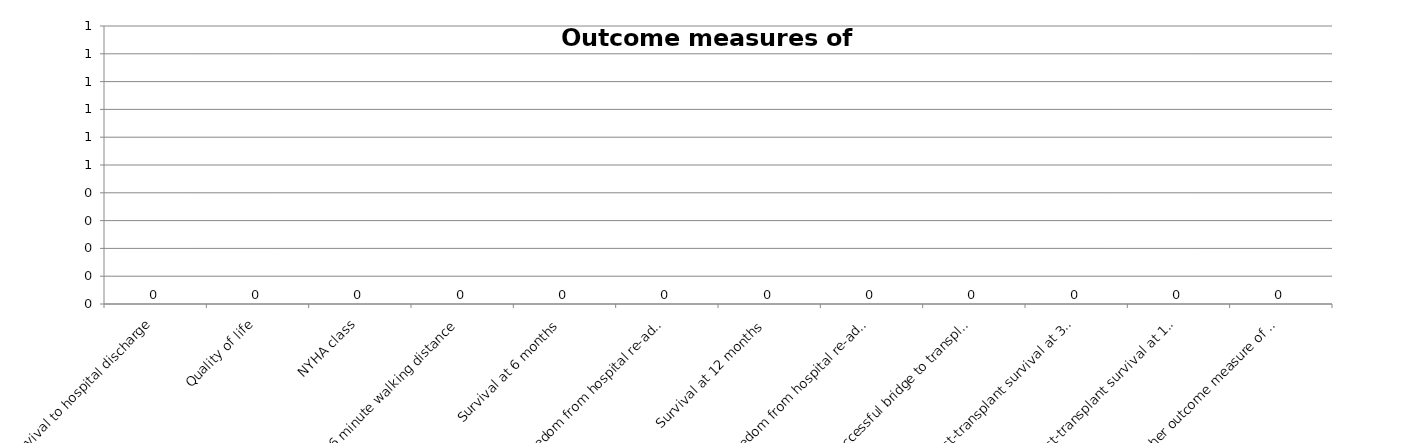
| Category | Series 0 |
|---|---|
| Survival to hospital discharge | 0 |
| Quality of life | 0 |
| NYHA class | 0 |
| 6 minute walking distance | 0 |
| Survival at 6 months | 0 |
| Freedom from hospital re-admission at 6 months from discharge, for complications related to the artificial heart | 0 |
| Survival at 12 months | 0 |
| Freedom from hospital re-admission at 12 months from discharge, for complications related to the artificial heart | 0 |
| Successful bridge to transplant | 0 |
| Post-transplant survival at 30 days | 0 |
| Post-transplant survival at 1 year | 0 |
| Other outcome measure of benefit | 0 |